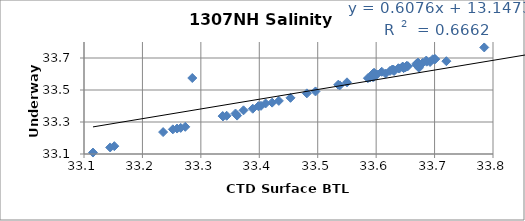
| Category | Series 0 |
|---|---|
| 34.684 | 33.692 |
| 33.7202 | 33.68 |
| 33.6457 | 33.646 |
| 33.6237 | 33.619 |
| 33.5944 | 33.599 |
| 33.5351 | 33.533 |
| 33.5501 | 33.548 |
| 33.5978 | 33.597 |
| 33.638 | 33.636 |
| 33.2853 | 33.575 |
| 33.4534 | 33.451 |
| 33.3888 | 33.383 |
| 33.2354 | 33.237 |
| 33.4108 | 33.416 |
| 33.422 | 33.421 |
| 33.3984 | 33.399 |
| 33.362 | 33.34 |
| 33.2733 | 33.27 |
| 33.4335 | 33.432 |
| 33.4029 | 33.401 |
| 33.6719 | 33.669 |
| 33.6923 | 33.675 |
| 33.6858 | 33.684 |
| 33.6522 | 33.647 |
| 33.6524 | 33.651 |
| 33.373 | 33.373 |
| 33.3379 | 33.335 |
| 33.2655 | 33.263 |
| 33.2521 | 33.254 |
| 33.2593 | 33.259 |
| 33.3373 | 33.337 |
| 33.3442 | 33.339 |
| 33.6715 | 33.671 |
| 33.6276 | 33.626 |
| 33.63 | 33.626 |
| 33.645 | 33.645 |
| 33.6279 | 33.628 |
| 33.5964 | 33.608 |
| 33.6096 | 33.614 |
| 33.6543 | 33.649 |
| 33.6397 | 33.634 |
| 33.6012 | 33.597 |
| 33.6693 | 33.665 |
| 33.3593 | 33.353 |
| 33.4962 | 33.491 |
| 33.1154 | 33.109 |
| 33.1448 | 33.141 |
| 33.1519 | 33.149 |
| 33.4814 | 33.479 |
| 33.6969 | 33.692 |
| 33.647 | 33.638 |
| 33.7 | 33.693 |
| 33.7012 | 33.693 |
| 33.785 | 33.766 |
| 33.5893 | 33.578 |
| 33.6691 | 33.657 |
| 33.6307 | 33.619 |
| 33.6161 | 33.603 |
| 33.5944 | 33.581 |
| 33.5889 | 33.578 |
| 33.5859 | 33.574 |
| 33.5959 | 33.582 |
| 33.595 | 33.603 |
| 33.6471 | 33.638 |
| 33.6733 | 33.639 |
| 33.6502 | 33.642 |
| 33.6795 | 33.669 |
| 33.6865 | 33.677 |
| 33.5377 | 33.529 |